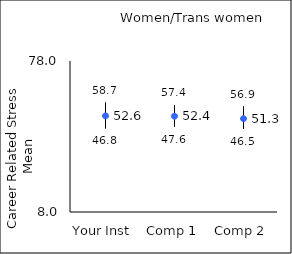
| Category | 25th percentile | 75th percentile | Mean |
|---|---|---|---|
| Your Inst | 46.8 | 58.7 | 52.56 |
| Comp 1 | 47.6 | 57.4 | 52.41 |
| Comp 2 | 46.5 | 56.9 | 51.26 |